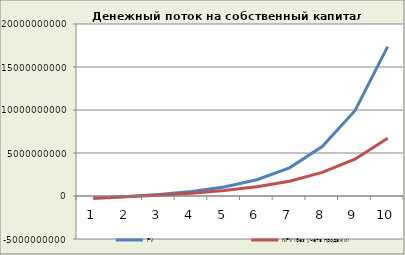
| Category | PV | NPV (без учета продажи) |
|---|---|---|
| 1.0 | -265258212.571 | -250087841.166 |
| 2.0 | -69335094.857 | -85893986.201 |
| 3.0 | 181736262.479 | 101137990.711 |
| 4.0 | 511337418.116 | 319388314.745 |
| 5.0 | 1038486045.764 | 629663275.404 |
| 6.0 | 1889528962.394 | 1074922153.709 |
| 7.0 | 3279395678.536 | 1721292998.421 |
| 8.0 | 5750544752.124 | 2742832175.477 |
| 9.0 | 9919805125.558 | 4274845622.208 |
| 10.0 | 17369284731.508 | 6708040941.225 |